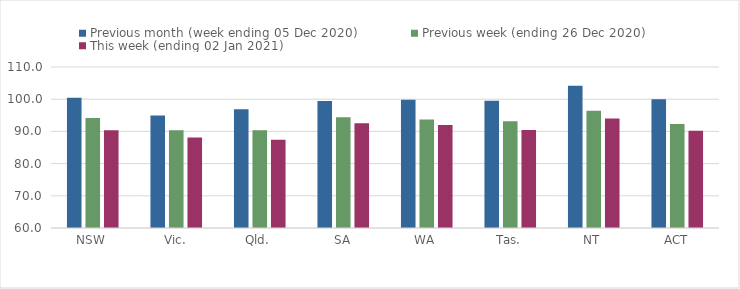
| Category | Previous month (week ending 05 Dec 2020) | Previous week (ending 26 Dec 2020) | This week (ending 02 Jan 2021) |
|---|---|---|---|
| NSW | 100.42 | 94.19 | 90.35 |
| Vic. | 94.92 | 90.33 | 88.13 |
| Qld. | 96.89 | 90.38 | 87.41 |
| SA | 99.44 | 94.4 | 92.54 |
| WA | 99.81 | 93.68 | 92.01 |
| Tas. | 99.51 | 93.17 | 90.4 |
| NT | 104.19 | 96.45 | 93.97 |
| ACT | 100.02 | 92.26 | 90.24 |